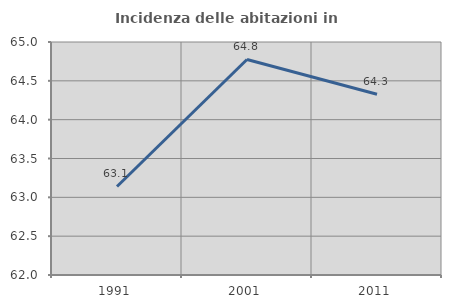
| Category | Incidenza delle abitazioni in proprietà  |
|---|---|
| 1991.0 | 63.14 |
| 2001.0 | 64.775 |
| 2011.0 | 64.327 |